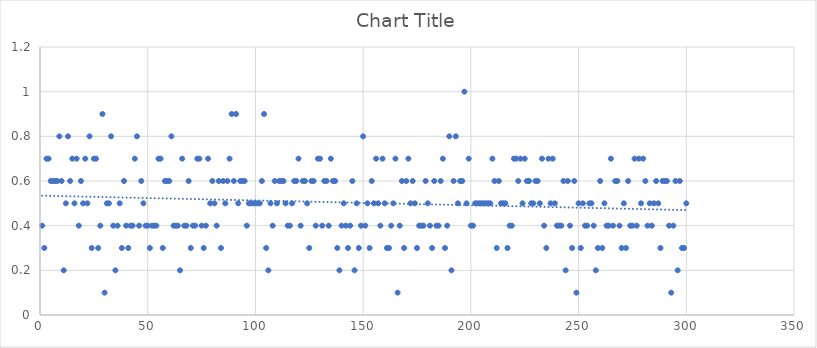
| Category | Series 0 |
|---|---|
| 1.0 | 0.4 |
| 2.0 | 0.3 |
| 3.0 | 0.7 |
| 4.0 | 0.7 |
| 5.0 | 0.6 |
| 6.0 | 0.6 |
| 7.0 | 0.6 |
| 8.0 | 0.6 |
| 9.0 | 0.8 |
| 10.0 | 0.6 |
| 11.0 | 0.2 |
| 12.0 | 0.5 |
| 13.0 | 0.8 |
| 14.0 | 0.6 |
| 15.0 | 0.7 |
| 16.0 | 0.5 |
| 17.0 | 0.7 |
| 18.0 | 0.4 |
| 19.0 | 0.6 |
| 20.0 | 0.5 |
| 21.0 | 0.7 |
| 22.0 | 0.5 |
| 23.0 | 0.8 |
| 24.0 | 0.3 |
| 25.0 | 0.7 |
| 26.0 | 0.7 |
| 27.0 | 0.3 |
| 28.0 | 0.4 |
| 29.0 | 0.9 |
| 30.0 | 0.1 |
| 31.0 | 0.5 |
| 32.0 | 0.5 |
| 33.0 | 0.8 |
| 34.0 | 0.4 |
| 35.0 | 0.2 |
| 36.0 | 0.4 |
| 37.0 | 0.5 |
| 38.0 | 0.3 |
| 39.0 | 0.6 |
| 40.0 | 0.4 |
| 41.0 | 0.3 |
| 42.0 | 0.4 |
| 43.0 | 0.4 |
| 44.0 | 0.7 |
| 45.0 | 0.8 |
| 46.0 | 0.4 |
| 47.0 | 0.6 |
| 48.0 | 0.5 |
| 49.0 | 0.4 |
| 50.0 | 0.4 |
| 51.0 | 0.3 |
| 52.0 | 0.4 |
| 53.0 | 0.4 |
| 54.0 | 0.4 |
| 55.0 | 0.7 |
| 56.0 | 0.7 |
| 57.0 | 0.3 |
| 58.0 | 0.6 |
| 59.0 | 0.6 |
| 60.0 | 0.6 |
| 61.0 | 0.8 |
| 62.0 | 0.4 |
| 63.0 | 0.4 |
| 64.0 | 0.4 |
| 65.0 | 0.2 |
| 66.0 | 0.7 |
| 67.0 | 0.4 |
| 68.0 | 0.4 |
| 69.0 | 0.6 |
| 70.0 | 0.3 |
| 71.0 | 0.4 |
| 72.0 | 0.4 |
| 73.0 | 0.7 |
| 74.0 | 0.7 |
| 75.0 | 0.4 |
| 76.0 | 0.3 |
| 77.0 | 0.4 |
| 78.0 | 0.7 |
| 79.0 | 0.5 |
| 80.0 | 0.6 |
| 81.0 | 0.5 |
| 82.0 | 0.4 |
| 83.0 | 0.6 |
| 84.0 | 0.3 |
| 85.0 | 0.6 |
| 86.0 | 0.5 |
| 87.0 | 0.6 |
| 88.0 | 0.7 |
| 89.0 | 0.9 |
| 90.0 | 0.6 |
| 91.0 | 0.9 |
| 92.0 | 0.5 |
| 93.0 | 0.6 |
| 94.0 | 0.6 |
| 95.0 | 0.6 |
| 96.0 | 0.4 |
| 97.0 | 0.5 |
| 98.0 | 0.5 |
| 99.0 | 0.5 |
| 100.0 | 0.5 |
| 101.0 | 0.5 |
| 102.0 | 0.5 |
| 103.0 | 0.6 |
| 104.0 | 0.9 |
| 105.0 | 0.3 |
| 106.0 | 0.2 |
| 107.0 | 0.5 |
| 108.0 | 0.4 |
| 109.0 | 0.6 |
| 110.0 | 0.5 |
| 111.0 | 0.6 |
| 112.0 | 0.6 |
| 113.0 | 0.6 |
| 114.0 | 0.5 |
| 115.0 | 0.4 |
| 116.0 | 0.4 |
| 117.0 | 0.5 |
| 118.0 | 0.6 |
| 119.0 | 0.6 |
| 120.0 | 0.7 |
| 121.0 | 0.4 |
| 122.0 | 0.6 |
| 123.0 | 0.6 |
| 124.0 | 0.5 |
| 125.0 | 0.3 |
| 126.0 | 0.6 |
| 127.0 | 0.6 |
| 128.0 | 0.4 |
| 129.0 | 0.7 |
| 130.0 | 0.7 |
| 131.0 | 0.4 |
| 132.0 | 0.6 |
| 133.0 | 0.6 |
| 134.0 | 0.4 |
| 135.0 | 0.7 |
| 136.0 | 0.6 |
| 137.0 | 0.6 |
| 138.0 | 0.3 |
| 139.0 | 0.2 |
| 140.0 | 0.4 |
| 141.0 | 0.5 |
| 142.0 | 0.4 |
| 143.0 | 0.3 |
| 144.0 | 0.4 |
| 145.0 | 0.6 |
| 146.0 | 0.2 |
| 147.0 | 0.5 |
| 148.0 | 0.3 |
| 149.0 | 0.4 |
| 150.0 | 0.8 |
| 151.0 | 0.4 |
| 152.0 | 0.5 |
| 153.0 | 0.3 |
| 154.0 | 0.6 |
| 155.0 | 0.5 |
| 156.0 | 0.7 |
| 157.0 | 0.5 |
| 158.0 | 0.4 |
| 159.0 | 0.7 |
| 160.0 | 0.5 |
| 161.0 | 0.3 |
| 162.0 | 0.3 |
| 163.0 | 0.4 |
| 164.0 | 0.5 |
| 165.0 | 0.7 |
| 166.0 | 0.1 |
| 167.0 | 0.4 |
| 168.0 | 0.6 |
| 169.0 | 0.3 |
| 170.0 | 0.6 |
| 171.0 | 0.7 |
| 172.0 | 0.5 |
| 173.0 | 0.6 |
| 174.0 | 0.5 |
| 175.0 | 0.3 |
| 176.0 | 0.4 |
| 177.0 | 0.4 |
| 178.0 | 0.4 |
| 179.0 | 0.6 |
| 180.0 | 0.5 |
| 181.0 | 0.4 |
| 182.0 | 0.3 |
| 183.0 | 0.6 |
| 184.0 | 0.4 |
| 185.0 | 0.4 |
| 186.0 | 0.6 |
| 187.0 | 0.7 |
| 188.0 | 0.3 |
| 189.0 | 0.4 |
| 190.0 | 0.8 |
| 191.0 | 0.2 |
| 192.0 | 0.6 |
| 193.0 | 0.8 |
| 194.0 | 0.5 |
| 195.0 | 0.6 |
| 196.0 | 0.6 |
| 197.0 | 1 |
| 198.0 | 0.5 |
| 199.0 | 0.7 |
| 200.0 | 0.4 |
| 201.0 | 0.4 |
| 202.0 | 0.5 |
| 203.0 | 0.5 |
| 204.0 | 0.5 |
| 205.0 | 0.5 |
| 206.0 | 0.5 |
| 207.0 | 0.5 |
| 208.0 | 0.5 |
| 209.0 | 0.5 |
| 210.0 | 0.7 |
| 211.0 | 0.6 |
| 212.0 | 0.3 |
| 213.0 | 0.6 |
| 214.0 | 0.5 |
| 215.0 | 0.5 |
| 216.0 | 0.5 |
| 217.0 | 0.3 |
| 218.0 | 0.4 |
| 219.0 | 0.4 |
| 220.0 | 0.7 |
| 221.0 | 0.7 |
| 222.0 | 0.6 |
| 223.0 | 0.7 |
| 224.0 | 0.5 |
| 225.0 | 0.7 |
| 226.0 | 0.6 |
| 227.0 | 0.6 |
| 228.0 | 0.5 |
| 229.0 | 0.5 |
| 230.0 | 0.6 |
| 231.0 | 0.6 |
| 232.0 | 0.5 |
| 233.0 | 0.7 |
| 234.0 | 0.4 |
| 235.0 | 0.3 |
| 236.0 | 0.7 |
| 237.0 | 0.5 |
| 238.0 | 0.7 |
| 239.0 | 0.5 |
| 240.0 | 0.4 |
| 241.0 | 0.4 |
| 242.0 | 0.4 |
| 243.0 | 0.6 |
| 244.0 | 0.2 |
| 245.0 | 0.6 |
| 246.0 | 0.4 |
| 247.0 | 0.3 |
| 248.0 | 0.6 |
| 249.0 | 0.1 |
| 250.0 | 0.5 |
| 251.0 | 0.3 |
| 252.0 | 0.5 |
| 253.0 | 0.4 |
| 254.0 | 0.4 |
| 255.0 | 0.5 |
| 256.0 | 0.5 |
| 257.0 | 0.4 |
| 258.0 | 0.2 |
| 259.0 | 0.3 |
| 260.0 | 0.6 |
| 261.0 | 0.3 |
| 262.0 | 0.5 |
| 263.0 | 0.4 |
| 264.0 | 0.4 |
| 265.0 | 0.7 |
| 266.0 | 0.4 |
| 267.0 | 0.6 |
| 268.0 | 0.6 |
| 269.0 | 0.4 |
| 270.0 | 0.3 |
| 271.0 | 0.5 |
| 272.0 | 0.3 |
| 273.0 | 0.6 |
| 274.0 | 0.4 |
| 275.0 | 0.4 |
| 276.0 | 0.7 |
| 277.0 | 0.4 |
| 278.0 | 0.7 |
| 279.0 | 0.5 |
| 280.0 | 0.7 |
| 281.0 | 0.6 |
| 282.0 | 0.4 |
| 283.0 | 0.5 |
| 284.0 | 0.4 |
| 285.0 | 0.5 |
| 286.0 | 0.6 |
| 287.0 | 0.5 |
| 288.0 | 0.3 |
| 289.0 | 0.6 |
| 290.0 | 0.6 |
| 291.0 | 0.6 |
| 292.0 | 0.4 |
| 293.0 | 0.1 |
| 294.0 | 0.4 |
| 295.0 | 0.6 |
| 296.0 | 0.2 |
| 297.0 | 0.6 |
| 298.0 | 0.3 |
| 299.0 | 0.3 |
| 300.0 | 0.5 |